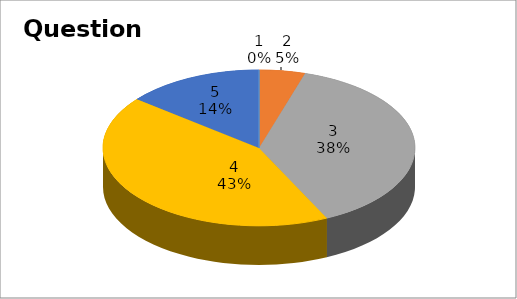
| Category | Series 0 |
|---|---|
| 0 | 0 |
| 1 | 1 |
| 2 | 8 |
| 3 | 9 |
| 4 | 3 |